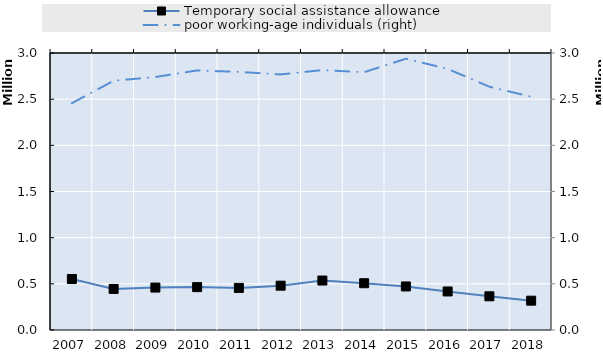
| Category | Temporary social assistance allowance |
|---|---|
| 2007.0 | 552604 |
| 2008.0 | 444683 |
| 2009.0 | 459600 |
| 2010.0 | 464400 |
| 2011.0 | 455606 |
| 2012.0 | 479937 |
| 2013.0 | 535743 |
| 2014.0 | 506646 |
| 2015.0 | 471518 |
| 2016.0 | 417432 |
| 2017.0 | 364887 |
| 2018.0 | 317560 |